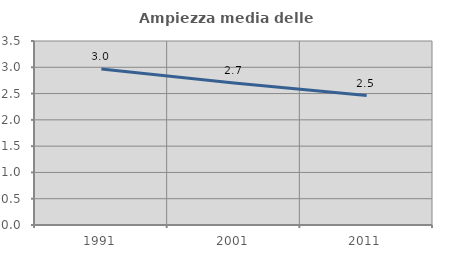
| Category | Ampiezza media delle famiglie |
|---|---|
| 1991.0 | 2.969 |
| 2001.0 | 2.703 |
| 2011.0 | 2.462 |